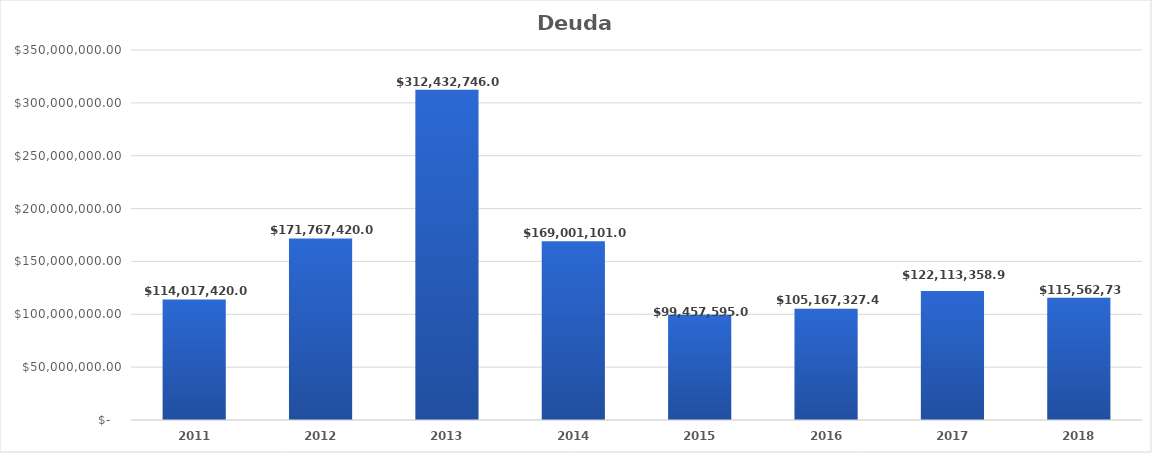
| Category | Deuda Pública |
|---|---|
| 2011.0 | 114017420 |
| 2012.0 | 171767420 |
| 2013.0 | 312432746 |
| 2014.0 | 169001101 |
| 2015.0 | 99457595 |
| 2016.0 | 105167327.47 |
| 2017.0 | 122113358.96 |
| 2018.0 | 115562738.17 |